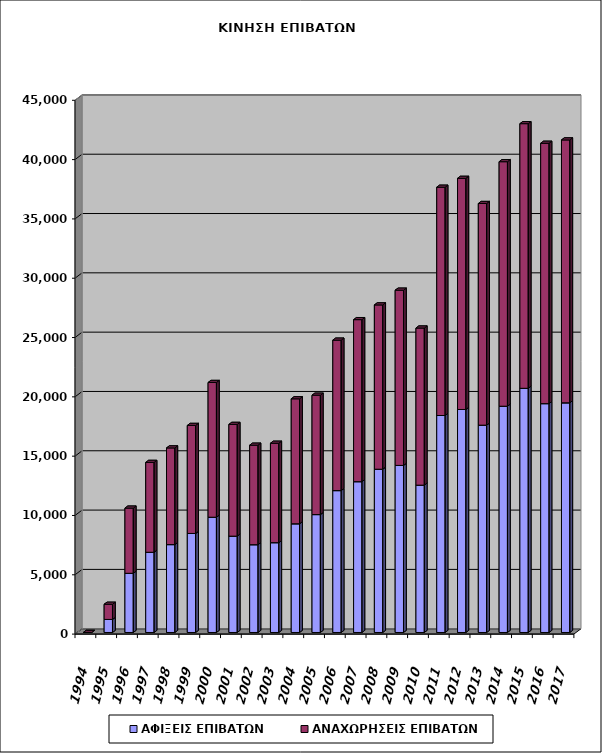
| Category | ΑΦΙΞΕΙΣ ΕΠΙΒΑΤΩΝ | ΑΝΑΧΩΡΗΣΕΙΣ ΕΠΙΒΑΤΩΝ |
|---|---|---|
| 1994.0 | 0 | 0 |
| 1995.0 | 1100 | 1279 |
| 1996.0 | 4988 | 5495 |
| 1997.0 | 6761 | 7576 |
| 1998.0 | 7408 | 8150 |
| 1999.0 | 8348 | 9105 |
| 2000.0 | 9716 | 11359 |
| 2001.0 | 8121 | 9419 |
| 2002.0 | 7400 | 8387 |
| 2003.0 | 7571 | 8381 |
| 2004.0 | 9164 | 10534 |
| 2005.0 | 9939 | 10065 |
| 2006.0 | 11961 | 12681 |
| 2007.0 | 12714 | 13658 |
| 2008.0 | 13764 | 13849 |
| 2009.0 | 14084 | 14771 |
| 2010.0 | 12419 | 13245 |
| 2011.0 | 18291 | 19243 |
| 2012.0 | 18799 | 19483 |
| 2013.0 | 17477 | 18685 |
| 2014.0 | 19074 | 20612 |
| 2015.0 | 20584 | 22308 |
| 2016.0 | 19292 | 21947 |
| 2017.0 | 19361 | 22160 |